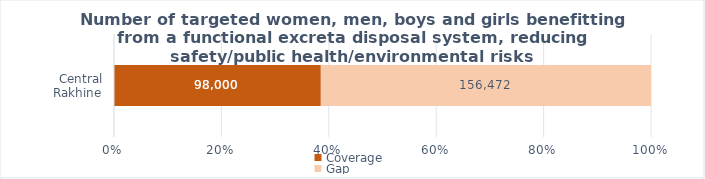
| Category | Coverage | Gap |
|---|---|---|
|  Central Rakhine  | 98000 | 156472 |